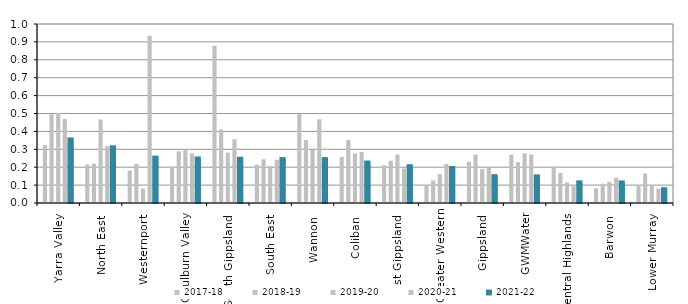
| Category | 2017-18 | 2018-19 | 2019-20 | 2020-21 | 2021-22 |
|---|---|---|---|---|---|
| Yarra Valley  | 0.323 | 0.495 | 0.503 | 0.469 | 0.355 |
| North East  | 0.215 | 0.22 | 0.467 | 0.318 | 0.311 |
| Westernport  | 0.181 | 0.218 | 0.081 | 0.935 | 0.253 |
| Goulburn Valley  | 0.203 | 0.289 | 0.297 | 0.277 | 0.249 |
| South Gippsland  | 0.879 | 0.411 | 0.282 | 0.357 | 0.248 |
| South East  | 0.214 | 0.244 | 0.206 | 0.242 | 0.245 |
| Wannon  | 0.499 | 0.351 | 0.296 | 0.468 | 0.245 |
| Coliban  | 0.257 | 0.352 | 0.277 | 0.285 | 0.226 |
| East Gippsland  | 0.21 | 0.236 | 0.27 | 0.193 | 0.206 |
| Greater Western | 0.095 | 0.127 | 0.162 | 0.218 | 0.196 |
| Gippsland  | 0.231 | 0.269 | 0.189 | 0.196 | 0.15 |
| GWMWater | 0.27 | 0.229 | 0.278 | 0.27 | 0.148 |
| Central Highlands  | 0.203 | 0.167 | 0.115 | 0.094 | 0.115 |
| Barwon  | 0.082 | 0.108 | 0.119 | 0.142 | 0.115 |
| Lower Murray  | 0.101 | 0.165 | 0.099 | 0.08 | 0.077 |